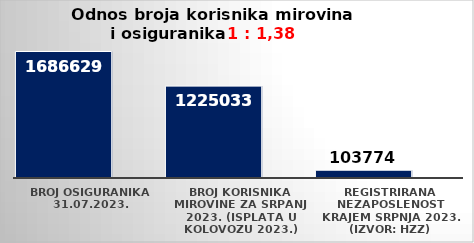
| Category | Series 0 | Series 1 |
|---|---|---|
| Broj osiguranika 31.07.2023. | 1686629 |  |
| Broj korisnika mirovine za srpanj 2023. (isplata u kolovozu 2023.) | 1225033 |  |
| Registrirana nezaposlenost krajem srpnja 2023. (izvor: HZZ) | 103774 |  |